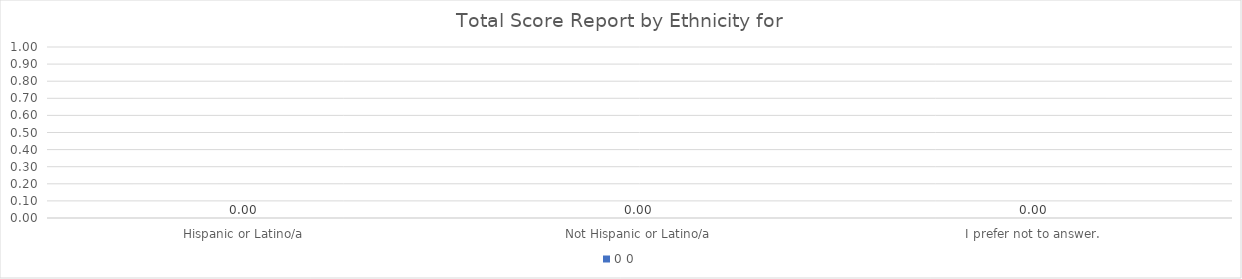
| Category | 0 |
|---|---|
| Hispanic or Latino/a | 0 |
| Not Hispanic or Latino/a | 0 |
| I prefer not to answer. | 0 |